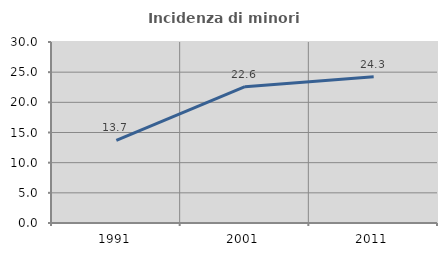
| Category | Incidenza di minori stranieri |
|---|---|
| 1991.0 | 13.699 |
| 2001.0 | 22.595 |
| 2011.0 | 24.258 |